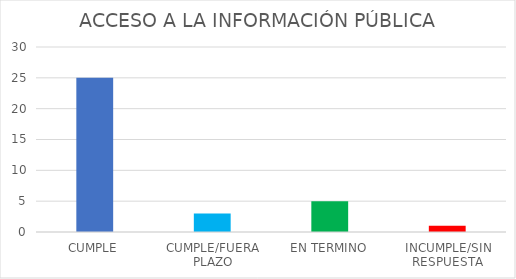
| Category | TOTAL |
|---|---|
| CUMPLE | 25 |
| CUMPLE/FUERA PLAZO | 3 |
| EN TERMINO | 5 |
| INCUMPLE/SIN RESPUESTA | 1 |